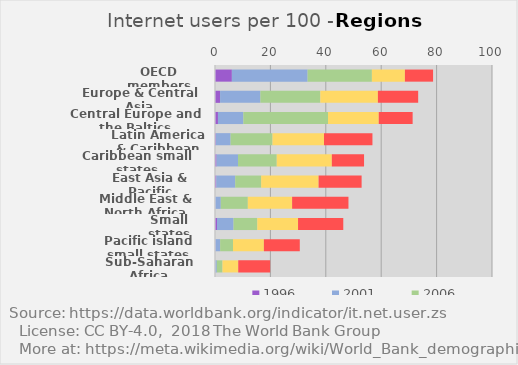
| Category | 1996 | 2001 | 2006 | 2011 | 2016 |
|---|---|---|---|---|---|
| OECD members | 6.09 | 27.34 | 23.21 | 11.92 | 10.17 |
| Europe & Central Asia | 1.84 | 14.55 | 21.63 | 20.79 | 14.54 |
| Central Europe and the Baltics | 1.07 | 9.17 | 30.56 | 18.32 | 12.23 |
| Latin America & Caribbean | 0.31 | 5.32 | 15.13 | 18.59 | 17.49 |
| Caribbean small states | 0.55 | 7.76 | 13.98 | 19.89 | 11.63 |
| East Asia & Pacific | 0.47 | 6.83 | 9.37 | 20.73 | 15.53 |
| Middle East & North Africa | 0.08 | 2.01 | 9.76 | 15.99 | 20.34 |
| Small states | 0.72 | 5.97 | 8.58 | 14.71 | 16.33 |
| Pacific island small states | 0.13 | 1.73 | 4.63 | 11.16 | 12.96 |
| Sub-Saharan Africa | 0.07 | 0.58 | 2.05 | 5.69 | 11.53 |